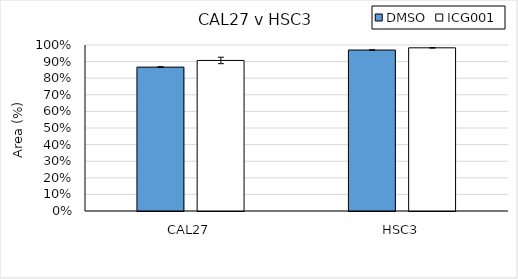
| Category | DMSO | ICG001 |
|---|---|---|
| 0 | 0.867 | 0.907 |
| 1 | 0.97 | 0.983 |